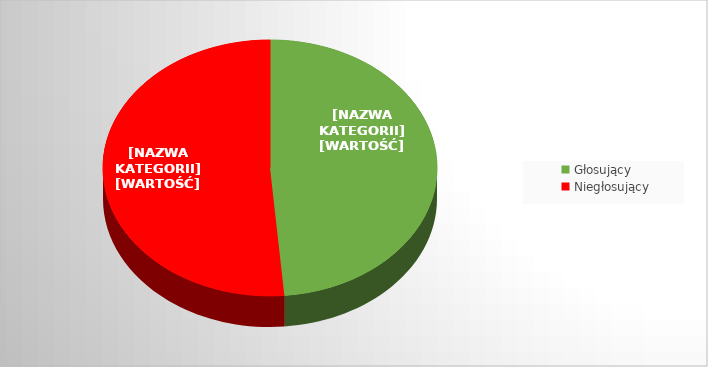
| Category | Series 0 |
|---|---|
| Głosujący | 0.486 |
| Niegłosujący | 0.514 |